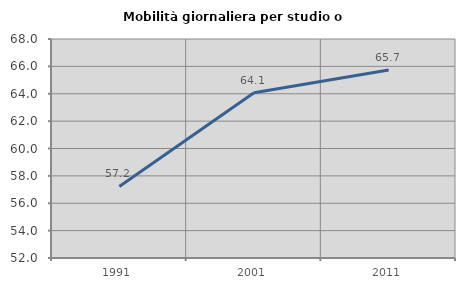
| Category | Mobilità giornaliera per studio o lavoro |
|---|---|
| 1991.0 | 57.224 |
| 2001.0 | 64.081 |
| 2011.0 | 65.733 |